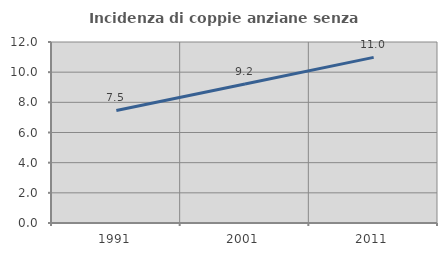
| Category | Incidenza di coppie anziane senza figli  |
|---|---|
| 1991.0 | 7.463 |
| 2001.0 | 9.211 |
| 2011.0 | 10.983 |